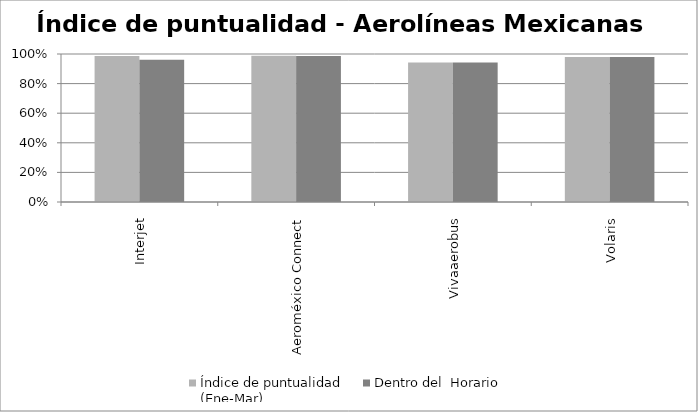
| Category | Índice de puntualidad
(Ene-Mar) | Dentro del  Horario |
|---|---|---|
| Interjet | 0.987 | 0.961 |
| Aeroméxico Connect | 0.989 | 0.986 |
| Vivaaerobus | 0.942 | 0.942 |
| Volaris | 0.98 | 0.98 |